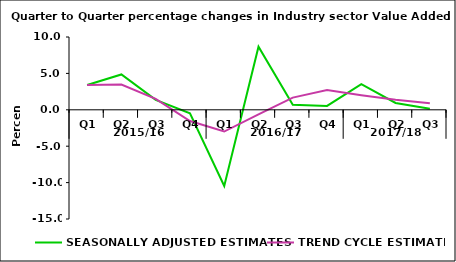
| Category | SEASONALLY ADJUSTED ESTIMATES | TREND CYCLE ESTIMATES |
|---|---|---|
| 0 | 3.403 | 3.419 |
| 1 | 4.855 | 3.48 |
| 2 | 1.357 | 1.505 |
| 3 | -0.49 | -1.538 |
| 4 | -10.464 | -2.985 |
| 5 | 8.675 | -0.614 |
| 6 | 0.698 | 1.67 |
| 7 | 0.527 | 2.701 |
| 8 | 3.52 | 1.986 |
| 9 | 0.934 | 1.365 |
| 10 | 0.132 | 0.903 |